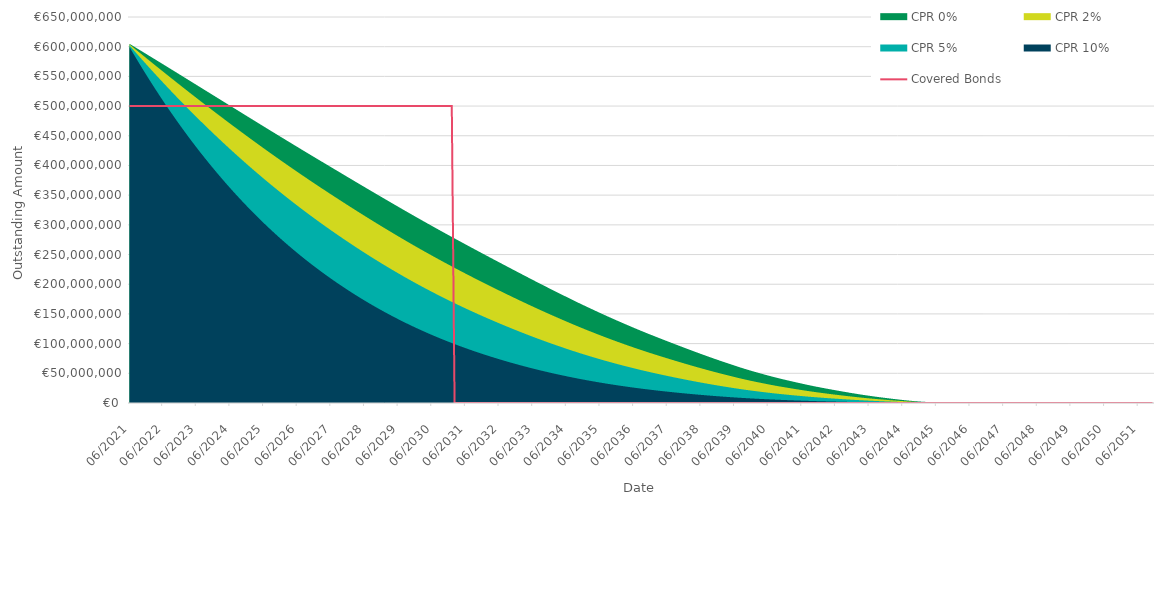
| Category | Covered Bonds |
|---|---|
| 2021-06-30 | 500000000 |
| 2021-07-31 | 500000000 |
| 2021-08-31 | 500000000 |
| 2021-09-30 | 500000000 |
| 2021-10-31 | 500000000 |
| 2021-11-30 | 500000000 |
| 2021-12-31 | 500000000 |
| 2022-01-31 | 500000000 |
| 2022-02-28 | 500000000 |
| 2022-03-31 | 500000000 |
| 2022-04-30 | 500000000 |
| 2022-05-31 | 500000000 |
| 2022-06-30 | 500000000 |
| 2022-07-31 | 500000000 |
| 2022-08-31 | 500000000 |
| 2022-09-30 | 500000000 |
| 2022-10-31 | 500000000 |
| 2022-11-30 | 500000000 |
| 2022-12-31 | 500000000 |
| 2023-01-31 | 500000000 |
| 2023-02-28 | 500000000 |
| 2023-03-31 | 500000000 |
| 2023-04-30 | 500000000 |
| 2023-05-31 | 500000000 |
| 2023-06-30 | 500000000 |
| 2023-07-31 | 500000000 |
| 2023-08-31 | 500000000 |
| 2023-09-30 | 500000000 |
| 2023-10-31 | 500000000 |
| 2023-11-30 | 500000000 |
| 2023-12-31 | 500000000 |
| 2024-01-31 | 500000000 |
| 2024-02-29 | 500000000 |
| 2024-03-31 | 500000000 |
| 2024-04-30 | 500000000 |
| 2024-05-31 | 500000000 |
| 2024-06-30 | 500000000 |
| 2024-07-31 | 500000000 |
| 2024-08-31 | 500000000 |
| 2024-09-30 | 500000000 |
| 2024-10-31 | 500000000 |
| 2024-11-30 | 500000000 |
| 2024-12-31 | 500000000 |
| 2025-01-31 | 500000000 |
| 2025-02-28 | 500000000 |
| 2025-03-31 | 500000000 |
| 2025-04-30 | 500000000 |
| 2025-05-31 | 500000000 |
| 2025-06-30 | 500000000 |
| 2025-07-31 | 500000000 |
| 2025-08-31 | 500000000 |
| 2025-09-30 | 500000000 |
| 2025-10-31 | 500000000 |
| 2025-11-30 | 500000000 |
| 2025-12-31 | 500000000 |
| 2026-01-31 | 500000000 |
| 2026-02-28 | 500000000 |
| 2026-03-31 | 500000000 |
| 2026-04-30 | 500000000 |
| 2026-05-31 | 500000000 |
| 2026-06-30 | 500000000 |
| 2026-07-31 | 500000000 |
| 2026-08-31 | 500000000 |
| 2026-09-30 | 500000000 |
| 2026-10-31 | 500000000 |
| 2026-11-30 | 500000000 |
| 2026-12-31 | 500000000 |
| 2027-01-31 | 500000000 |
| 2027-02-28 | 500000000 |
| 2027-03-31 | 500000000 |
| 2027-04-30 | 500000000 |
| 2027-05-31 | 500000000 |
| 2027-06-30 | 500000000 |
| 2027-07-31 | 500000000 |
| 2027-08-31 | 500000000 |
| 2027-09-30 | 500000000 |
| 2027-10-31 | 500000000 |
| 2027-11-30 | 500000000 |
| 2027-12-31 | 500000000 |
| 2028-01-31 | 500000000 |
| 2028-02-29 | 500000000 |
| 2028-03-31 | 500000000 |
| 2028-04-30 | 500000000 |
| 2028-05-31 | 500000000 |
| 2028-06-30 | 500000000 |
| 2028-07-31 | 500000000 |
| 2028-08-31 | 500000000 |
| 2028-09-30 | 500000000 |
| 2028-10-31 | 500000000 |
| 2028-11-30 | 500000000 |
| 2028-12-31 | 500000000 |
| 2029-01-31 | 500000000 |
| 2029-02-28 | 500000000 |
| 2029-03-31 | 500000000 |
| 2029-04-30 | 500000000 |
| 2029-05-31 | 500000000 |
| 2029-06-30 | 500000000 |
| 2029-07-31 | 500000000 |
| 2029-08-31 | 500000000 |
| 2029-09-30 | 500000000 |
| 2029-10-31 | 500000000 |
| 2029-11-30 | 500000000 |
| 2029-12-31 | 500000000 |
| 2030-01-31 | 500000000 |
| 2030-02-28 | 500000000 |
| 2030-03-31 | 500000000 |
| 2030-04-30 | 500000000 |
| 2030-05-31 | 500000000 |
| 2030-06-30 | 500000000 |
| 2030-07-31 | 500000000 |
| 2030-08-31 | 500000000 |
| 2030-09-30 | 500000000 |
| 2030-10-31 | 500000000 |
| 2030-11-30 | 500000000 |
| 2030-12-31 | 500000000 |
| 2031-01-31 | 500000000 |
| 2031-02-28 | 0 |
| 2031-03-31 | 0 |
| 2031-04-30 | 0 |
| 2031-05-31 | 0 |
| 2031-06-30 | 0 |
| 2031-07-31 | 0 |
| 2031-08-31 | 0 |
| 2031-09-30 | 0 |
| 2031-10-31 | 0 |
| 2031-11-30 | 0 |
| 2031-12-31 | 0 |
| 2032-01-31 | 0 |
| 2032-02-29 | 0 |
| 2032-03-31 | 0 |
| 2032-04-30 | 0 |
| 2032-05-31 | 0 |
| 2032-06-30 | 0 |
| 2032-07-31 | 0 |
| 2032-08-31 | 0 |
| 2032-09-30 | 0 |
| 2032-10-31 | 0 |
| 2032-11-30 | 0 |
| 2032-12-31 | 0 |
| 2033-01-31 | 0 |
| 2033-02-28 | 0 |
| 2033-03-31 | 0 |
| 2033-04-30 | 0 |
| 2033-05-31 | 0 |
| 2033-06-30 | 0 |
| 2033-07-31 | 0 |
| 2033-08-31 | 0 |
| 2033-09-30 | 0 |
| 2033-10-31 | 0 |
| 2033-11-30 | 0 |
| 2033-12-31 | 0 |
| 2034-01-31 | 0 |
| 2034-02-28 | 0 |
| 2034-03-31 | 0 |
| 2034-04-30 | 0 |
| 2034-05-31 | 0 |
| 2034-06-30 | 0 |
| 2034-07-31 | 0 |
| 2034-08-31 | 0 |
| 2034-09-30 | 0 |
| 2034-10-31 | 0 |
| 2034-11-30 | 0 |
| 2034-12-31 | 0 |
| 2035-01-31 | 0 |
| 2035-02-28 | 0 |
| 2035-03-31 | 0 |
| 2035-04-30 | 0 |
| 2035-05-31 | 0 |
| 2035-06-30 | 0 |
| 2035-07-31 | 0 |
| 2035-08-31 | 0 |
| 2035-09-30 | 0 |
| 2035-10-31 | 0 |
| 2035-11-30 | 0 |
| 2035-12-31 | 0 |
| 2036-01-31 | 0 |
| 2036-02-29 | 0 |
| 2036-03-31 | 0 |
| 2036-04-30 | 0 |
| 2036-05-31 | 0 |
| 2036-06-30 | 0 |
| 2036-07-31 | 0 |
| 2036-08-31 | 0 |
| 2036-09-30 | 0 |
| 2036-10-31 | 0 |
| 2036-11-30 | 0 |
| 2036-12-31 | 0 |
| 2037-01-31 | 0 |
| 2037-02-28 | 0 |
| 2037-03-31 | 0 |
| 2037-04-30 | 0 |
| 2037-05-31 | 0 |
| 2037-06-30 | 0 |
| 2037-07-31 | 0 |
| 2037-08-31 | 0 |
| 2037-09-30 | 0 |
| 2037-10-31 | 0 |
| 2037-11-30 | 0 |
| 2037-12-31 | 0 |
| 2038-01-31 | 0 |
| 2038-02-28 | 0 |
| 2038-03-31 | 0 |
| 2038-04-30 | 0 |
| 2038-05-31 | 0 |
| 2038-06-30 | 0 |
| 2038-07-31 | 0 |
| 2038-08-31 | 0 |
| 2038-09-30 | 0 |
| 2038-10-31 | 0 |
| 2038-11-30 | 0 |
| 2038-12-31 | 0 |
| 2039-01-31 | 0 |
| 2039-02-28 | 0 |
| 2039-03-31 | 0 |
| 2039-04-30 | 0 |
| 2039-05-31 | 0 |
| 2039-06-30 | 0 |
| 2039-07-31 | 0 |
| 2039-08-31 | 0 |
| 2039-09-30 | 0 |
| 2039-10-31 | 0 |
| 2039-11-30 | 0 |
| 2039-12-31 | 0 |
| 2040-01-31 | 0 |
| 2040-02-29 | 0 |
| 2040-03-31 | 0 |
| 2040-04-30 | 0 |
| 2040-05-31 | 0 |
| 2040-06-30 | 0 |
| 2040-07-31 | 0 |
| 2040-08-31 | 0 |
| 2040-09-30 | 0 |
| 2040-10-31 | 0 |
| 2040-11-30 | 0 |
| 2040-12-31 | 0 |
| 2041-01-31 | 0 |
| 2041-02-28 | 0 |
| 2041-03-31 | 0 |
| 2041-04-30 | 0 |
| 2041-05-31 | 0 |
| 2041-06-30 | 0 |
| 2041-07-31 | 0 |
| 2041-08-31 | 0 |
| 2041-09-30 | 0 |
| 2041-10-31 | 0 |
| 2041-11-30 | 0 |
| 2041-12-31 | 0 |
| 2042-01-31 | 0 |
| 2042-02-28 | 0 |
| 2042-03-31 | 0 |
| 2042-04-30 | 0 |
| 2042-05-31 | 0 |
| 2042-06-30 | 0 |
| 2042-07-31 | 0 |
| 2042-08-31 | 0 |
| 2042-09-30 | 0 |
| 2042-10-31 | 0 |
| 2042-11-30 | 0 |
| 2042-12-31 | 0 |
| 2043-01-31 | 0 |
| 2043-02-28 | 0 |
| 2043-03-31 | 0 |
| 2043-04-30 | 0 |
| 2043-05-31 | 0 |
| 2043-06-30 | 0 |
| 2043-07-31 | 0 |
| 2043-08-31 | 0 |
| 2043-09-30 | 0 |
| 2043-10-31 | 0 |
| 2043-11-30 | 0 |
| 2043-12-31 | 0 |
| 2044-01-31 | 0 |
| 2044-02-29 | 0 |
| 2044-03-31 | 0 |
| 2044-04-30 | 0 |
| 2044-05-31 | 0 |
| 2044-06-30 | 0 |
| 2044-07-31 | 0 |
| 2044-08-31 | 0 |
| 2044-09-30 | 0 |
| 2044-10-31 | 0 |
| 2044-11-30 | 0 |
| 2044-12-31 | 0 |
| 2045-01-31 | 0 |
| 2045-02-28 | 0 |
| 2045-03-31 | 0 |
| 2045-04-30 | 0 |
| 2045-05-31 | 0 |
| 2045-06-30 | 0 |
| 2045-07-31 | 0 |
| 2045-08-31 | 0 |
| 2045-09-30 | 0 |
| 2045-10-31 | 0 |
| 2045-11-30 | 0 |
| 2045-12-31 | 0 |
| 2046-01-31 | 0 |
| 2046-02-28 | 0 |
| 2046-03-31 | 0 |
| 2046-04-30 | 0 |
| 2046-05-31 | 0 |
| 2046-06-30 | 0 |
| 2046-07-31 | 0 |
| 2046-08-31 | 0 |
| 2046-09-30 | 0 |
| 2046-10-31 | 0 |
| 2046-11-30 | 0 |
| 2046-12-31 | 0 |
| 2047-01-31 | 0 |
| 2047-02-28 | 0 |
| 2047-03-31 | 0 |
| 2047-04-30 | 0 |
| 2047-05-31 | 0 |
| 2047-06-30 | 0 |
| 2047-07-31 | 0 |
| 2047-08-31 | 0 |
| 2047-09-30 | 0 |
| 2047-10-31 | 0 |
| 2047-11-30 | 0 |
| 2047-12-31 | 0 |
| 2048-01-31 | 0 |
| 2048-02-29 | 0 |
| 2048-03-31 | 0 |
| 2048-04-30 | 0 |
| 2048-05-31 | 0 |
| 2048-06-30 | 0 |
| 2048-07-31 | 0 |
| 2048-08-31 | 0 |
| 2048-09-30 | 0 |
| 2048-10-31 | 0 |
| 2048-11-30 | 0 |
| 2048-12-31 | 0 |
| 2049-01-31 | 0 |
| 2049-02-28 | 0 |
| 2049-03-31 | 0 |
| 2049-04-30 | 0 |
| 2049-05-31 | 0 |
| 2049-06-30 | 0 |
| 2049-07-31 | 0 |
| 2049-08-31 | 0 |
| 2049-09-30 | 0 |
| 2049-10-31 | 0 |
| 2049-11-30 | 0 |
| 2049-12-31 | 0 |
| 2050-01-31 | 0 |
| 2050-02-28 | 0 |
| 2050-03-31 | 0 |
| 2050-04-30 | 0 |
| 2050-05-31 | 0 |
| 2050-06-30 | 0 |
| 2050-07-31 | 0 |
| 2050-08-31 | 0 |
| 2050-09-30 | 0 |
| 2050-10-31 | 0 |
| 2050-11-30 | 0 |
| 2050-12-31 | 0 |
| 2051-01-31 | 0 |
| 2051-02-28 | 0 |
| 2051-03-31 | 0 |
| 2051-04-30 | 0 |
| 2051-05-31 | 0 |
| 2051-06-30 | 0 |
| 2051-07-31 | 0 |
| 2051-08-31 | 0 |
| 2051-09-30 | 0 |
| 2051-10-31 | 0 |
| 2051-11-30 | 0 |